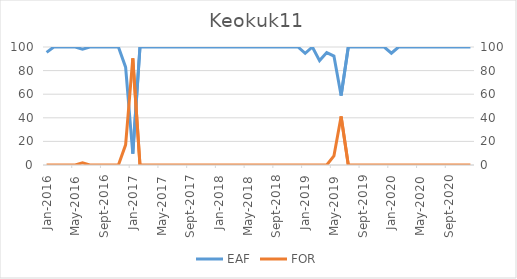
| Category | EAF |
|---|---|
| 2016-01-01 | 95.41 |
| 2016-02-01 | 100 |
| 2016-03-01 | 100 |
| 2016-04-01 | 100 |
| 2016-05-01 | 100 |
| 2016-06-01 | 98.1 |
| 2016-07-01 | 100 |
| 2016-08-01 | 100 |
| 2016-09-01 | 100 |
| 2016-10-01 | 100 |
| 2016-11-01 | 100 |
| 2016-12-01 | 82.93 |
| 2017-01-01 | 9.68 |
| 2017-02-01 | 100 |
| 2017-03-01 | 100 |
| 2017-04-01 | 100 |
| 2017-05-01 | 100 |
| 2017-06-01 | 100 |
| 2017-07-01 | 100 |
| 2017-08-01 | 100 |
| 2017-09-01 | 100 |
| 2017-10-01 | 100 |
| 2017-11-01 | 100 |
| 2017-12-01 | 100 |
| 2018-01-01 | 100 |
| 2018-02-01 | 100 |
| 2018-03-01 | 100 |
| 2018-04-01 | 100 |
| 2018-05-01 | 100 |
| 2018-06-01 | 100 |
| 2018-07-01 | 100 |
| 2018-08-01 | 100 |
| 2018-09-01 | 100 |
| 2018-10-01 | 100 |
| 2018-11-01 | 100 |
| 2018-12-01 | 100 |
| 2019-01-01 | 94.62 |
| 2019-02-01 | 100 |
| 2019-03-01 | 88.46 |
| 2019-04-01 | 95.27 |
| 2019-05-01 | 92.35 |
| 2019-06-01 | 58.81 |
| 2019-07-01 | 100 |
| 2019-08-01 | 100 |
| 2019-09-01 | 100 |
| 2019-10-01 | 100 |
| 2019-11-01 | 100 |
| 2019-12-01 | 100 |
| 2020-01-01 | 94.7 |
| 2020-02-01 | 100 |
| 2020-03-01 | 100 |
| 2020-04-01 | 100 |
| 2020-05-01 | 100 |
| 2020-06-01 | 100 |
| 2020-07-01 | 100 |
| 2020-08-01 | 100 |
| 2020-09-01 | 100 |
| 2020-10-01 | 100 |
| 2020-11-01 | 100 |
| 2020-12-01 | 100 |